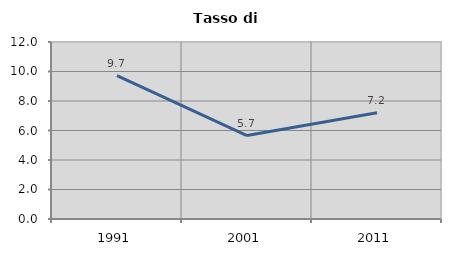
| Category | Tasso di disoccupazione   |
|---|---|
| 1991.0 | 9.725 |
| 2001.0 | 5.659 |
| 2011.0 | 7.21 |